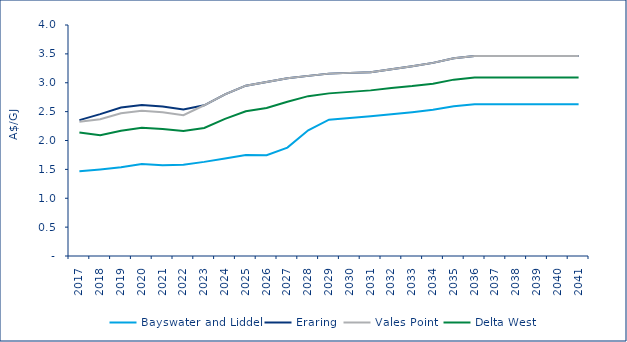
| Category | Bayswater and Liddel | Eraring | Vales Point | Delta West |
|---|---|---|---|---|
| 2017.0 | 1.469 | 2.353 | 2.324 | 2.139 |
| 2018.0 | 1.499 | 2.456 | 2.368 | 2.092 |
| 2019.0 | 1.536 | 2.572 | 2.472 | 2.167 |
| 2020.0 | 1.593 | 2.613 | 2.513 | 2.219 |
| 2021.0 | 1.572 | 2.589 | 2.489 | 2.199 |
| 2022.0 | 1.581 | 2.538 | 2.438 | 2.164 |
| 2023.0 | 1.63 | 2.61 | 2.61 | 2.218 |
| 2024.0 | 1.689 | 2.799 | 2.799 | 2.374 |
| 2025.0 | 1.747 | 2.949 | 2.949 | 2.506 |
| 2026.0 | 1.744 | 3.014 | 3.014 | 2.562 |
| 2027.0 | 1.877 | 3.079 | 3.079 | 2.67 |
| 2028.0 | 2.177 | 3.119 | 3.119 | 2.768 |
| 2029.0 | 2.361 | 3.158 | 3.158 | 2.816 |
| 2030.0 | 2.389 | 3.171 | 3.171 | 2.842 |
| 2031.0 | 2.418 | 3.18 | 3.18 | 2.868 |
| 2032.0 | 2.454 | 3.232 | 3.232 | 2.911 |
| 2033.0 | 2.49 | 3.287 | 3.287 | 2.942 |
| 2034.0 | 2.534 | 3.344 | 3.344 | 2.982 |
| 2035.0 | 2.594 | 3.424 | 3.424 | 3.054 |
| 2036.0 | 2.626 | 3.465 | 3.465 | 3.09 |
| 2037.0 | 2.626 | 3.465 | 3.465 | 3.09 |
| 2038.0 | 2.626 | 3.465 | 3.465 | 3.09 |
| 2039.0 | 2.626 | 3.465 | 3.465 | 3.09 |
| 2040.0 | 2.626 | 3.465 | 3.465 | 3.09 |
| 2041.0 | 2.626 | 3.465 | 3.465 | 3.09 |